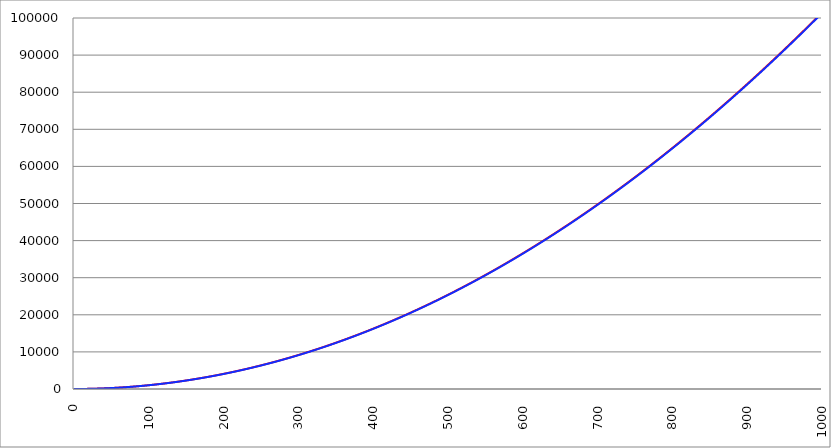
| Category | Series 1 | Series 0 | Series 2 |
|---|---|---|---|
| 0.0 | 0.167 |  | 0 |
| 1.0 | 0.2 |  | 0.101 |
| 2.0 | 0.714 |  | 0.405 |
| 3.0 | 1.4 |  | 0.912 |
| 4.0 | 2.273 |  | 1.621 |
| 5.0 | 3.341 |  | 2.533 |
| 6.0 | 4.609 |  | 3.648 |
| 7.0 | 6.079 |  | 4.965 |
| 8.0 | 7.751 |  | 6.485 |
| 9.0 | 9.625 |  | 8.207 |
| 10.0 | 11.703 |  | 10.132 |
| 11.0 | 13.982 |  | 12.26 |
| 12.0 | 16.465 |  | 14.59 |
| 13.0 | 19.15 |  | 17.123 |
| 14.0 | 22.037 |  | 19.859 |
| 15.0 | 25.128 |  | 22.797 |
| 16.0 | 28.421 |  | 25.938 |
| 17.0 | 31.916 |  | 29.282 |
| 18.0 | 35.614 |  | 32.828 |
| 19.0 | 39.515 |  | 36.577 |
| 20.0 | 43.619 |  | 40.528 |
| 21.0 | 47.925 |  | 44.683 |
| 22.0 | 52.434 |  | 49.039 |
| 23.0 | 57.145 |  | 53.599 |
| 24.0 | 62.059 |  | 58.361 |
| 25.0 | 67.176 |  | 63.326 |
| 26.0 | 72.495 |  | 68.493 |
| 27.0 | 78.017 |  | 73.863 |
| 28.0 | 83.742 |  | 79.436 |
| 29.0 | 89.669 |  | 85.211 |
| 30.0 | 95.799 |  | 91.189 |
| 31.0 | 102.132 |  | 97.37 |
| 32.0 | 108.667 |  | 103.753 |
| 33.0 | 115.405 |  | 110.339 |
| 34.0 | 122.345 |  | 117.127 |
| 35.0 | 129.488 |  | 124.118 |
| 36.0 | 136.834 |  | 131.312 |
| 37.0 | 144.383 |  | 138.709 |
| 38.0 | 152.134 |  | 146.308 |
| 39.0 | 160.087 |  | 154.11 |
| 40.0 | 168.244 |  | 162.114 |
| 41.0 | 176.603 |  | 170.321 |
| 42.0 | 185.164 |  | 178.731 |
| 43.0 | 193.929 |  | 187.343 |
| 44.0 | 202.896 |  | 196.158 |
| 45.0 | 212.065 |  | 205.175 |
| 46.0 | 221.437 |  | 214.396 |
| 47.0 | 231.012 |  | 223.818 |
| 48.0 | 240.79 |  | 233.444 |
| 49.0 | 250.77 |  | 243.272 |
| 50.0 | 260.953 |  | 253.303 |
| 51.0 | 271.338 |  | 263.536 |
| 52.0 | 281.926 |  | 273.972 |
| 53.0 | 292.717 |  | 284.611 |
| 54.0 | 303.71 |  | 295.453 |
| 55.0 | 314.906 |  | 306.497 |
| 56.0 | 326.305 |  | 317.743 |
| 57.0 | 337.906 |  | 329.193 |
| 58.0 | 349.71 |  | 340.844 |
| 59.0 | 361.717 |  | 352.699 |
| 60.0 | 373.926 |  | 364.756 |
| 61.0 | 386.338 |  | 377.016 |
| 62.0 | 398.952 |  | 389.479 |
| 63.0 | 411.769 |  | 402.144 |
| 64.0 | 424.789 |  | 415.012 |
| 65.0 | 438.011 |  | 428.082 |
| 66.0 | 451.437 |  | 441.355 |
| 67.0 | 465.064 |  | 454.831 |
| 68.0 | 478.895 |  | 468.509 |
| 69.0 | 492.928 |  | 482.39 |
| 70.0 | 507.163 |  | 496.474 |
| 71.0 | 521.601 |  | 510.76 |
| 72.0 | 536.242 |  | 525.249 |
| 73.0 | 551.086 |  | 539.941 |
| 74.0 | 566.132 |  | 554.835 |
| 75.0 | 581.381 |  | 569.932 |
| 76.0 | 596.832 |  | 585.231 |
| 77.0 | 612.487 |  | 600.733 |
| 78.0 | 628.343 |  | 616.438 |
| 79.0 | 644.403 |  | 632.346 |
| 80.0 | 660.665 |  | 648.456 |
| 81.0 | 677.129 |  | 664.768 |
| 82.0 | 693.797 |  | 681.284 |
| 83.0 | 710.667 |  | 698.002 |
| 84.0 | 727.739 |  | 714.922 |
| 85.0 | 745.015 |  | 732.046 |
| 86.0 | 762.493 |  | 749.371 |
| 87.0 | 780.173 |  | 766.9 |
| 88.0 | 798.056 |  | 784.631 |
| 89.0 | 816.142 |  | 802.565 |
| 90.0 | 834.431 |  | 820.702 |
| 91.0 | 852.922 |  | 839.041 |
| 92.0 | 871.615 |  | 857.582 |
| 93.0 | 890.512 |  | 876.327 |
| 94.0 | 909.611 |  | 895.274 |
| 95.0 | 928.913 |  | 914.424 |
| 96.0 | 948.417 |  | 933.776 |
| 97.0 | 968.124 |  | 953.331 |
| 98.0 | 988.034 |  | 973.089 |
| 99.0 | 1008.146 |  | 993.049 |
| 100.0 | 1028.461 |  | 1013.212 |
| 101.0 | 1048.978 |  | 1033.577 |
| 102.0 | 1069.698 |  | 1054.146 |
| 103.0 | 1090.621 |  | 1074.916 |
| 104.0 | 1111.747 |  | 1095.89 |
| 105.0 | 1133.075 |  | 1117.066 |
| 106.0 | 1154.606 |  | 1138.445 |
| 107.0 | 1176.339 |  | 1160.026 |
| 108.0 | 1198.275 |  | 1181.81 |
| 109.0 | 1220.414 |  | 1203.797 |
| 110.0 | 1242.755 |  | 1225.986 |
| 111.0 | 1265.299 |  | 1248.378 |
| 112.0 | 1288.046 |  | 1270.973 |
| 113.0 | 1310.995 |  | 1293.77 |
| 114.0 | 1334.147 |  | 1316.77 |
| 115.0 | 1357.501 |  | 1339.973 |
| 116.0 | 1381.058 |  | 1363.378 |
| 117.0 | 1404.818 |  | 1386.986 |
| 118.0 | 1428.781 |  | 1410.796 |
| 119.0 | 1452.946 |  | 1434.809 |
| 120.0 | 1477.314 |  | 1459.025 |
| 121.0 | 1501.884 |  | 1483.443 |
| 122.0 | 1526.657 |  | 1508.064 |
| 123.0 | 1551.633 |  | 1532.888 |
| 124.0 | 1576.811 |  | 1557.915 |
| 125.0 | 1602.192 |  | 1583.143 |
| 126.0 | 1627.775 |  | 1608.575 |
| 127.0 | 1653.562 |  | 1634.209 |
| 128.0 | 1679.551 |  | 1660.046 |
| 129.0 | 1705.742 |  | 1686.086 |
| 130.0 | 1732.136 |  | 1712.328 |
| 131.0 | 1758.733 |  | 1738.773 |
| 132.0 | 1785.533 |  | 1765.42 |
| 133.0 | 1812.535 |  | 1792.27 |
| 134.0 | 1839.739 |  | 1819.323 |
| 135.0 | 1867.147 |  | 1846.579 |
| 136.0 | 1894.757 |  | 1874.037 |
| 137.0 | 1922.569 |  | 1901.697 |
| 138.0 | 1950.585 |  | 1929.561 |
| 139.0 | 1978.803 |  | 1957.627 |
| 140.0 | 2007.223 |  | 1985.895 |
| 141.0 | 2035.847 |  | 2014.366 |
| 142.0 | 2064.672 |  | 2043.04 |
| 143.0 | 2093.701 |  | 2071.917 |
| 144.0 | 2122.932 |  | 2100.996 |
| 145.0 | 2152.366 |  | 2130.278 |
| 146.0 | 2182.002 |  | 2159.762 |
| 147.0 | 2211.841 |  | 2189.449 |
| 148.0 | 2241.883 |  | 2219.339 |
| 149.0 | 2272.128 |  | 2249.432 |
| 150.0 | 2302.575 |  | 2279.727 |
| 151.0 | 2333.224 |  | 2310.224 |
| 152.0 | 2364.077 |  | 2340.925 |
| 153.0 | 2395.131 |  | 2371.828 |
| 154.0 | 2426.389 |  | 2402.933 |
| 155.0 | 2457.849 |  | 2434.241 |
| 156.0 | 2489.512 |  | 2465.752 |
| 157.0 | 2521.378 |  | 2497.466 |
| 158.0 | 2553.446 |  | 2529.382 |
| 159.0 | 2585.717 |  | 2561.501 |
| 160.0 | 2618.19 |  | 2593.822 |
| 161.0 | 2650.866 |  | 2626.346 |
| 162.0 | 2683.745 |  | 2659.073 |
| 163.0 | 2716.826 |  | 2692.003 |
| 164.0 | 2750.11 |  | 2725.135 |
| 165.0 | 2783.597 |  | 2758.469 |
| 166.0 | 2817.286 |  | 2792.007 |
| 167.0 | 2851.178 |  | 2825.746 |
| 168.0 | 2885.273 |  | 2859.689 |
| 169.0 | 2919.57 |  | 2893.834 |
| 170.0 | 2954.07 |  | 2928.182 |
| 171.0 | 2988.772 |  | 2962.733 |
| 172.0 | 3023.677 |  | 2997.486 |
| 173.0 | 3058.785 |  | 3032.442 |
| 174.0 | 3094.096 |  | 3067.6 |
| 175.0 | 3129.609 |  | 3102.961 |
| 176.0 | 3165.324 |  | 3138.525 |
| 177.0 | 3201.243 |  | 3174.291 |
| 178.0 | 3237.364 |  | 3210.26 |
| 179.0 | 3273.687 |  | 3246.432 |
| 180.0 | 3310.214 |  | 3282.806 |
| 181.0 | 3346.943 |  | 3319.383 |
| 182.0 | 3383.874 |  | 3356.163 |
| 183.0 | 3421.008 |  | 3393.145 |
| 184.0 | 3458.345 |  | 3430.33 |
| 185.0 | 3495.885 |  | 3467.718 |
| 186.0 | 3533.627 |  | 3505.308 |
| 187.0 | 3571.572 |  | 3543.1 |
| 188.0 | 3609.719 |  | 3581.096 |
| 189.0 | 3648.069 |  | 3619.294 |
| 190.0 | 3686.622 |  | 3657.695 |
| 191.0 | 3725.377 |  | 3696.298 |
| 192.0 | 3764.335 |  | 3735.104 |
| 193.0 | 3803.496 |  | 3774.113 |
| 194.0 | 3842.859 |  | 3813.324 |
| 195.0 | 3882.425 |  | 3852.738 |
| 196.0 | 3922.194 |  | 3892.355 |
| 197.0 | 3962.165 |  | 3932.174 |
| 198.0 | 4002.339 |  | 3972.196 |
| 199.0 | 4042.715 |  | 4012.42 |
| 200.0 | 4083.294 |  | 4052.847 |
| 201.0 | 4124.076 |  | 4093.477 |
| 202.0 | 4165.061 |  | 4134.31 |
| 203.0 | 4206.248 |  | 4175.345 |
| 204.0 | 4247.637 |  | 4216.582 |
| 205.0 | 4289.23 |  | 4258.023 |
| 206.0 | 4331.025 |  | 4299.666 |
| 207.0 | 4373.022 |  | 4341.511 |
| 208.0 | 4415.223 |  | 4383.56 |
| 209.0 | 4457.625 |  | 4425.811 |
| 210.0 | 4500.231 |  | 4468.264 |
| 211.0 | 4543.039 |  | 4510.92 |
| 212.0 | 4586.05 |  | 4553.779 |
| 213.0 | 4629.264 |  | 4596.841 |
| 214.0 | 4672.68 |  | 4640.105 |
| 215.0 | 4716.298 |  | 4683.572 |
| 216.0 | 4760.12 |  | 4727.241 |
| 217.0 | 4804.144 |  | 4771.113 |
| 218.0 | 4848.371 |  | 4815.188 |
| 219.0 | 4892.8 |  | 4859.465 |
| 220.0 | 4937.432 |  | 4903.945 |
| 221.0 | 4982.267 |  | 4948.628 |
| 222.0 | 5027.304 |  | 4993.513 |
| 223.0 | 5072.544 |  | 5038.601 |
| 224.0 | 5117.986 |  | 5083.892 |
| 225.0 | 5163.631 |  | 5129.385 |
| 226.0 | 5209.479 |  | 5175.081 |
| 227.0 | 5255.53 |  | 5220.979 |
| 228.0 | 5301.783 |  | 5267.08 |
| 229.0 | 5348.239 |  | 5313.384 |
| 230.0 | 5394.897 |  | 5359.891 |
| 231.0 | 5441.758 |  | 5406.6 |
| 232.0 | 5488.822 |  | 5453.511 |
| 233.0 | 5536.088 |  | 5500.626 |
| 234.0 | 5583.557 |  | 5547.943 |
| 235.0 | 5631.229 |  | 5595.462 |
| 236.0 | 5679.103 |  | 5643.185 |
| 237.0 | 5727.18 |  | 5691.11 |
| 238.0 | 5775.459 |  | 5739.237 |
| 239.0 | 5823.942 |  | 5787.567 |
| 240.0 | 5872.626 |  | 5836.1 |
| 241.0 | 5921.514 |  | 5884.836 |
| 242.0 | 5970.604 |  | 5933.774 |
| 243.0 | 6019.897 |  | 5982.915 |
| 244.0 | 6069.392 |  | 6032.258 |
| 245.0 | 6119.09 |  | 6081.804 |
| 246.0 | 6168.991 |  | 6131.553 |
| 247.0 | 6219.094 |  | 6181.504 |
| 248.0 | 6269.4 |  | 6231.658 |
| 249.0 | 6319.909 |  | 6282.015 |
| 250.0 | 6370.62 |  | 6332.574 |
| 251.0 | 6421.534 |  | 6383.336 |
| 252.0 | 6472.651 |  | 6434.3 |
| 253.0 | 6523.97 |  | 6485.468 |
| 254.0 | 6575.492 |  | 6536.837 |
| 255.0 | 6627.216 |  | 6588.41 |
| 256.0 | 6679.143 |  | 6640.185 |
| 257.0 | 6731.273 |  | 6692.163 |
| 258.0 | 6783.605 |  | 6744.343 |
| 259.0 | 6836.14 |  | 6796.726 |
| 260.0 | 6888.878 |  | 6849.312 |
| 261.0 | 6941.818 |  | 6902.1 |
| 262.0 | 6994.961 |  | 6955.091 |
| 263.0 | 7048.307 |  | 7008.285 |
| 264.0 | 7101.855 |  | 7061.681 |
| 265.0 | 7155.606 |  | 7115.28 |
| 266.0 | 7209.559 |  | 7169.082 |
| 267.0 | 7263.716 |  | 7223.086 |
| 268.0 | 7318.074 |  | 7277.293 |
| 269.0 | 7372.636 |  | 7331.702 |
| 270.0 | 7427.4 |  | 7386.314 |
| 271.0 | 7482.367 |  | 7441.129 |
| 272.0 | 7537.536 |  | 7496.146 |
| 273.0 | 7592.908 |  | 7551.366 |
| 274.0 | 7648.483 |  | 7606.789 |
| 275.0 | 7704.26 |  | 7662.415 |
| 276.0 | 7760.24 |  | 7718.242 |
| 277.0 | 7816.423 |  | 7774.273 |
| 278.0 | 7872.808 |  | 7830.506 |
| 279.0 | 7929.396 |  | 7886.942 |
| 280.0 | 7986.186 |  | 7943.581 |
| 281.0 | 8043.18 |  | 8000.422 |
| 282.0 | 8100.375 |  | 8057.466 |
| 283.0 | 8157.774 |  | 8114.712 |
| 284.0 | 8215.375 |  | 8172.161 |
| 285.0 | 8273.179 |  | 8229.813 |
| 286.0 | 8331.185 |  | 8287.668 |
| 287.0 | 8389.394 |  | 8345.725 |
| 288.0 | 8447.806 |  | 8403.984 |
| 289.0 | 8506.42 |  | 8462.447 |
| 290.0 | 8565.237 |  | 8521.112 |
| 291.0 | 8624.257 |  | 8579.979 |
| 292.0 | 8683.479 |  | 8639.049 |
| 293.0 | 8742.904 |  | 8698.322 |
| 294.0 | 8802.531 |  | 8757.798 |
| 295.0 | 8862.361 |  | 8817.476 |
| 296.0 | 8922.394 |  | 8877.357 |
| 297.0 | 8982.63 |  | 8937.44 |
| 298.0 | 9043.068 |  | 8997.726 |
| 299.0 | 9103.708 |  | 9058.215 |
| 300.0 | 9164.552 |  | 9118.907 |
| 301.0 | 9225.598 |  | 9179.801 |
| 302.0 | 9286.846 |  | 9240.897 |
| 303.0 | 9348.298 |  | 9302.197 |
| 304.0 | 9409.952 |  | 9363.699 |
| 305.0 | 9471.808 |  | 9425.403 |
| 306.0 | 9533.867 |  | 9487.31 |
| 307.0 | 9596.129 |  | 9549.42 |
| 308.0 | 9658.594 |  | 9611.733 |
| 309.0 | 9721.261 |  | 9674.248 |
| 310.0 | 9784.131 |  | 9736.966 |
| 311.0 | 9847.203 |  | 9799.886 |
| 312.0 | 9910.478 |  | 9863.009 |
| 313.0 | 9973.956 |  | 9926.335 |
| 314.0 | 10037.636 |  | 9989.863 |
| 315.0 | 10101.519 |  | 10053.594 |
| 316.0 | 10165.605 |  | 10117.528 |
| 317.0 | 10229.893 |  | 10181.664 |
| 318.0 | 10294.384 |  | 10246.003 |
| 319.0 | 10359.078 |  | 10310.545 |
| 320.0 | 10423.974 |  | 10375.289 |
| 321.0 | 10489.073 |  | 10440.236 |
| 322.0 | 10554.374 |  | 10505.386 |
| 323.0 | 10619.879 |  | 10570.738 |
| 324.0 | 10685.585 |  | 10636.293 |
| 325.0 | 10751.495 |  | 10702.05 |
| 326.0 | 10817.607 |  | 10768.01 |
| 327.0 | 10883.922 |  | 10834.173 |
| 328.0 | 10950.439 |  | 10900.538 |
| 329.0 | 11017.159 |  | 10967.106 |
| 330.0 | 11084.082 |  | 11033.877 |
| 331.0 | 11151.207 |  | 11100.85 |
| 332.0 | 11218.535 |  | 11168.026 |
| 333.0 | 11286.065 |  | 11235.405 |
| 334.0 | 11353.799 |  | 11302.986 |
| 335.0 | 11421.734 |  | 11370.77 |
| 336.0 | 11489.873 |  | 11438.756 |
| 337.0 | 11558.214 |  | 11506.946 |
| 338.0 | 11626.758 |  | 11575.337 |
| 339.0 | 11695.504 |  | 11643.932 |
| 340.0 | 11764.453 |  | 11712.729 |
| 341.0 | 11833.605 |  | 11781.729 |
| 342.0 | 11902.959 |  | 11850.931 |
| 343.0 | 11972.516 |  | 11920.336 |
| 344.0 | 12042.276 |  | 11989.944 |
| 345.0 | 12112.238 |  | 12059.754 |
| 346.0 | 12182.403 |  | 12129.767 |
| 347.0 | 12252.771 |  | 12199.982 |
| 348.0 | 12323.341 |  | 12270.401 |
| 349.0 | 12394.114 |  | 12341.021 |
| 350.0 | 12465.089 |  | 12411.845 |
| 351.0 | 12536.267 |  | 12482.871 |
| 352.0 | 12607.648 |  | 12554.1 |
| 353.0 | 12679.232 |  | 12625.531 |
| 354.0 | 12751.018 |  | 12697.165 |
| 355.0 | 12823.006 |  | 12769.002 |
| 356.0 | 12895.198 |  | 12841.042 |
| 357.0 | 12967.592 |  | 12913.284 |
| 358.0 | 13040.188 |  | 12985.728 |
| 359.0 | 13112.988 |  | 13058.375 |
| 360.0 | 13185.989 |  | 13131.225 |
| 361.0 | 13259.194 |  | 13204.278 |
| 362.0 | 13332.601 |  | 13277.533 |
| 363.0 | 13406.211 |  | 13350.991 |
| 364.0 | 13480.024 |  | 13424.652 |
| 365.0 | 13554.039 |  | 13498.515 |
| 366.0 | 13628.256 |  | 13572.58 |
| 367.0 | 13702.677 |  | 13646.849 |
| 368.0 | 13777.3 |  | 13721.32 |
| 369.0 | 13852.126 |  | 13795.994 |
| 370.0 | 13927.154 |  | 13870.87 |
| 371.0 | 14002.385 |  | 13945.949 |
| 372.0 | 14077.819 |  | 14021.231 |
| 373.0 | 14153.455 |  | 14096.715 |
| 374.0 | 14229.294 |  | 14172.402 |
| 375.0 | 14305.335 |  | 14248.291 |
| 376.0 | 14381.579 |  | 14324.384 |
| 377.0 | 14458.026 |  | 14400.679 |
| 378.0 | 14534.676 |  | 14477.176 |
| 379.0 | 14611.528 |  | 14553.876 |
| 380.0 | 14688.583 |  | 14630.779 |
| 381.0 | 14765.84 |  | 14707.884 |
| 382.0 | 14843.3 |  | 14785.192 |
| 383.0 | 14920.963 |  | 14862.703 |
| 384.0 | 14998.828 |  | 14940.416 |
| 385.0 | 15076.896 |  | 15018.332 |
| 386.0 | 15155.167 |  | 15096.451 |
| 387.0 | 15233.64 |  | 15174.772 |
| 388.0 | 15312.316 |  | 15253.296 |
| 389.0 | 15391.194 |  | 15332.023 |
| 390.0 | 15470.276 |  | 15410.952 |
| 391.0 | 15549.559 |  | 15490.084 |
| 392.0 | 15629.046 |  | 15569.418 |
| 393.0 | 15708.735 |  | 15648.955 |
| 394.0 | 15788.627 |  | 15728.695 |
| 395.0 | 15868.721 |  | 15808.638 |
| 396.0 | 15949.018 |  | 15888.783 |
| 397.0 | 16029.518 |  | 15969.13 |
| 398.0 | 16110.22 |  | 16049.681 |
| 399.0 | 16191.125 |  | 16130.434 |
| 400.0 | 16272.233 |  | 16211.389 |
| 401.0 | 16353.543 |  | 16292.548 |
| 402.0 | 16435.056 |  | 16373.909 |
| 403.0 | 16516.771 |  | 16455.472 |
| 404.0 | 16598.69 |  | 16537.238 |
| 405.0 | 16680.81 |  | 16619.207 |
| 406.0 | 16763.134 |  | 16701.379 |
| 407.0 | 16845.66 |  | 16783.753 |
| 408.0 | 16928.389 |  | 16866.33 |
| 409.0 | 17011.32 |  | 16949.109 |
| 410.0 | 17094.454 |  | 17032.091 |
| 411.0 | 17177.791 |  | 17115.276 |
| 412.0 | 17261.33 |  | 17198.663 |
| 413.0 | 17345.072 |  | 17282.253 |
| 414.0 | 17429.017 |  | 17366.046 |
| 415.0 | 17513.164 |  | 17450.041 |
| 416.0 | 17597.514 |  | 17534.239 |
| 417.0 | 17682.066 |  | 17618.639 |
| 418.0 | 17766.822 |  | 17703.242 |
| 419.0 | 17851.779 |  | 17788.048 |
| 420.0 | 17936.94 |  | 17873.057 |
| 421.0 | 18022.303 |  | 17958.268 |
| 422.0 | 18107.869 |  | 18043.682 |
| 423.0 | 18193.637 |  | 18129.298 |
| 424.0 | 18279.608 |  | 18215.117 |
| 425.0 | 18365.782 |  | 18301.139 |
| 426.0 | 18452.158 |  | 18387.363 |
| 427.0 | 18538.737 |  | 18473.79 |
| 428.0 | 18625.519 |  | 18560.42 |
| 429.0 | 18712.503 |  | 18647.252 |
| 430.0 | 18799.69 |  | 18734.287 |
| 431.0 | 18887.079 |  | 18821.524 |
| 432.0 | 18974.671 |  | 18908.965 |
| 433.0 | 19062.466 |  | 18996.607 |
| 434.0 | 19150.464 |  | 19084.453 |
| 435.0 | 19238.664 |  | 19172.501 |
| 436.0 | 19327.066 |  | 19260.752 |
| 437.0 | 19415.672 |  | 19349.205 |
| 438.0 | 19504.48 |  | 19437.861 |
| 439.0 | 19593.49 |  | 19526.72 |
| 440.0 | 19682.704 |  | 19615.781 |
| 441.0 | 19772.12 |  | 19705.045 |
| 442.0 | 19861.738 |  | 19794.512 |
| 443.0 | 19951.56 |  | 19884.181 |
| 444.0 | 20041.583 |  | 19974.053 |
| 445.0 | 20131.81 |  | 20064.127 |
| 446.0 | 20222.239 |  | 20154.405 |
| 447.0 | 20312.871 |  | 20244.884 |
| 448.0 | 20403.705 |  | 20335.567 |
| 449.0 | 20494.742 |  | 20426.452 |
| 450.0 | 20585.982 |  | 20517.54 |
| 451.0 | 20677.425 |  | 20608.83 |
| 452.0 | 20769.07 |  | 20700.323 |
| 453.0 | 20860.917 |  | 20792.019 |
| 454.0 | 20952.967 |  | 20883.917 |
| 455.0 | 21045.22 |  | 20976.018 |
| 456.0 | 21137.676 |  | 21068.322 |
| 457.0 | 21230.334 |  | 21160.828 |
| 458.0 | 21323.195 |  | 21253.537 |
| 459.0 | 21416.259 |  | 21346.448 |
| 460.0 | 21509.525 |  | 21439.562 |
| 461.0 | 21602.994 |  | 21532.879 |
| 462.0 | 21696.665 |  | 21626.399 |
| 463.0 | 21790.539 |  | 21720.121 |
| 464.0 | 21884.616 |  | 21814.046 |
| 465.0 | 21978.895 |  | 21908.173 |
| 466.0 | 22073.377 |  | 22002.503 |
| 467.0 | 22168.062 |  | 22097.036 |
| 468.0 | 22262.949 |  | 22191.771 |
| 469.0 | 22358.039 |  | 22286.709 |
| 470.0 | 22453.332 |  | 22381.849 |
| 471.0 | 22548.827 |  | 22477.193 |
| 472.0 | 22644.525 |  | 22572.739 |
| 473.0 | 22740.425 |  | 22668.487 |
| 474.0 | 22836.528 |  | 22764.438 |
| 475.0 | 22932.834 |  | 22860.592 |
| 476.0 | 23029.342 |  | 22956.949 |
| 477.0 | 23126.054 |  | 23053.508 |
| 478.0 | 23222.967 |  | 23150.269 |
| 479.0 | 23320.084 |  | 23247.234 |
| 480.0 | 23417.403 |  | 23344.401 |
| 481.0 | 23514.924 |  | 23441.77 |
| 482.0 | 23612.649 |  | 23539.343 |
| 483.0 | 23710.575 |  | 23637.118 |
| 484.0 | 23808.705 |  | 23735.095 |
| 485.0 | 23907.037 |  | 23833.275 |
| 486.0 | 24005.572 |  | 23931.658 |
| 487.0 | 24104.31 |  | 24030.244 |
| 488.0 | 24203.25 |  | 24129.032 |
| 489.0 | 24302.393 |  | 24228.023 |
| 490.0 | 24401.738 |  | 24327.216 |
| 491.0 | 24501.286 |  | 24426.612 |
| 492.0 | 24601.037 |  | 24526.211 |
| 493.0 | 24700.99 |  | 24626.012 |
| 494.0 | 24801.146 |  | 24726.016 |
| 495.0 | 24901.505 |  | 24826.223 |
| 496.0 | 25002.066 |  | 24926.632 |
| 497.0 | 25102.83 |  | 25027.244 |
| 498.0 | 25203.796 |  | 25128.059 |
| 499.0 | 25304.966 |  | 25229.076 |
| 500.0 | 25406.337 |  | 25330.296 |
| 501.0 | 25507.912 |  | 25431.718 |
| 502.0 | 25609.689 |  | 25533.344 |
| 503.0 | 25711.669 |  | 25635.171 |
| 504.0 | 25813.851 |  | 25737.202 |
| 505.0 | 25916.236 |  | 25839.435 |
| 506.0 | 26018.824 |  | 25941.871 |
| 507.0 | 26121.614 |  | 26044.509 |
| 508.0 | 26224.607 |  | 26147.35 |
| 509.0 | 26327.803 |  | 26250.394 |
| 510.0 | 26431.201 |  | 26353.64 |
| 511.0 | 26534.802 |  | 26457.089 |
| 512.0 | 26638.606 |  | 26560.74 |
| 513.0 | 26742.612 |  | 26664.595 |
| 514.0 | 26846.821 |  | 26768.651 |
| 515.0 | 26951.232 |  | 26872.911 |
| 516.0 | 27055.846 |  | 26977.373 |
| 517.0 | 27160.663 |  | 27082.038 |
| 518.0 | 27265.682 |  | 27186.905 |
| 519.0 | 27370.905 |  | 27291.975 |
| 520.0 | 27476.329 |  | 27397.248 |
| 521.0 | 27581.957 |  | 27502.723 |
| 522.0 | 27687.787 |  | 27608.401 |
| 523.0 | 27793.819 |  | 27714.282 |
| 524.0 | 27900.054 |  | 27820.365 |
| 525.0 | 28006.492 |  | 27926.651 |
| 526.0 | 28113.133 |  | 28033.14 |
| 527.0 | 28219.976 |  | 28139.831 |
| 528.0 | 28327.022 |  | 28246.725 |
| 529.0 | 28434.27 |  | 28353.821 |
| 530.0 | 28541.721 |  | 28461.12 |
| 531.0 | 28649.375 |  | 28568.622 |
| 532.0 | 28757.232 |  | 28676.327 |
| 533.0 | 28865.291 |  | 28784.234 |
| 534.0 | 28973.552 |  | 28892.343 |
| 535.0 | 29082.017 |  | 29000.656 |
| 536.0 | 29190.684 |  | 29109.171 |
| 537.0 | 29299.553 |  | 29217.888 |
| 538.0 | 29408.626 |  | 29326.809 |
| 539.0 | 29517.9 |  | 29435.932 |
| 540.0 | 29627.378 |  | 29545.257 |
| 541.0 | 29737.058 |  | 29654.785 |
| 542.0 | 29846.941 |  | 29764.516 |
| 543.0 | 29957.026 |  | 29874.45 |
| 544.0 | 30067.315 |  | 29984.586 |
| 545.0 | 30177.805 |  | 30094.925 |
| 546.0 | 30288.499 |  | 30205.466 |
| 547.0 | 30399.395 |  | 30316.21 |
| 548.0 | 30510.493 |  | 30427.157 |
| 549.0 | 30621.795 |  | 30538.306 |
| 550.0 | 30733.299 |  | 30649.658 |
| 551.0 | 30845.005 |  | 30761.213 |
| 552.0 | 30956.915 |  | 30872.97 |
| 553.0 | 31069.026 |  | 30984.93 |
| 554.0 | 31181.341 |  | 31097.092 |
| 555.0 | 31293.858 |  | 31209.458 |
| 556.0 | 31406.578 |  | 31322.025 |
| 557.0 | 31519.5 |  | 31434.796 |
| 558.0 | 31632.626 |  | 31547.769 |
| 559.0 | 31745.953 |  | 31660.945 |
| 560.0 | 31859.484 |  | 31774.323 |
| 561.0 | 31973.217 |  | 31887.904 |
| 562.0 | 32087.152 |  | 32001.688 |
| 563.0 | 32201.291 |  | 32115.674 |
| 564.0 | 32315.632 |  | 32229.863 |
| 565.0 | 32430.175 |  | 32344.255 |
| 566.0 | 32544.921 |  | 32458.849 |
| 567.0 | 32659.87 |  | 32573.646 |
| 568.0 | 32775.022 |  | 32688.646 |
| 569.0 | 32890.376 |  | 32803.848 |
| 570.0 | 33005.933 |  | 32919.253 |
| 571.0 | 33121.692 |  | 33034.86 |
| 572.0 | 33237.654 |  | 33150.67 |
| 573.0 | 33353.819 |  | 33266.683 |
| 574.0 | 33470.187 |  | 33382.898 |
| 575.0 | 33586.757 |  | 33499.316 |
| 576.0 | 33703.529 |  | 33615.937 |
| 577.0 | 33820.504 |  | 33732.76 |
| 578.0 | 33937.682 |  | 33849.786 |
| 579.0 | 34055.063 |  | 33967.015 |
| 580.0 | 34172.646 |  | 34084.446 |
| 581.0 | 34290.432 |  | 34202.08 |
| 582.0 | 34408.421 |  | 34319.917 |
| 583.0 | 34526.612 |  | 34437.956 |
| 584.0 | 34645.006 |  | 34556.198 |
| 585.0 | 34763.602 |  | 34674.642 |
| 586.0 | 34882.401 |  | 34793.289 |
| 587.0 | 35001.403 |  | 34912.139 |
| 588.0 | 35120.607 |  | 35031.191 |
| 589.0 | 35240.014 |  | 35150.446 |
| 590.0 | 35359.624 |  | 35269.904 |
| 591.0 | 35479.436 |  | 35389.564 |
| 592.0 | 35599.451 |  | 35509.427 |
| 593.0 | 35719.669 |  | 35629.493 |
| 594.0 | 35840.089 |  | 35749.761 |
| 595.0 | 35960.712 |  | 35870.232 |
| 596.0 | 36081.537 |  | 35990.906 |
| 597.0 | 36202.566 |  | 36111.782 |
| 598.0 | 36323.796 |  | 36232.861 |
| 599.0 | 36445.23 |  | 36354.142 |
| 600.0 | 36566.866 |  | 36475.626 |
| 601.0 | 36688.705 |  | 36597.313 |
| 602.0 | 36810.746 |  | 36719.202 |
| 603.0 | 36932.99 |  | 36841.294 |
| 604.0 | 37055.437 |  | 36963.589 |
| 605.0 | 37178.086 |  | 37086.086 |
| 606.0 | 37300.938 |  | 37208.786 |
| 607.0 | 37423.992 |  | 37331.689 |
| 608.0 | 37547.25 |  | 37454.794 |
| 609.0 | 37670.709 |  | 37578.102 |
| 610.0 | 37794.372 |  | 37701.612 |
| 611.0 | 37918.237 |  | 37825.326 |
| 612.0 | 38042.305 |  | 37949.241 |
| 613.0 | 38166.575 |  | 38073.36 |
| 614.0 | 38291.048 |  | 38197.681 |
| 615.0 | 38415.724 |  | 38322.205 |
| 616.0 | 38540.602 |  | 38446.931 |
| 617.0 | 38665.683 |  | 38571.86 |
| 618.0 | 38790.967 |  | 38696.992 |
| 619.0 | 38916.453 |  | 38822.326 |
| 620.0 | 39042.142 |  | 38947.863 |
| 621.0 | 39168.034 |  | 39073.603 |
| 622.0 | 39294.128 |  | 39199.545 |
| 623.0 | 39420.425 |  | 39325.69 |
| 624.0 | 39546.924 |  | 39452.037 |
| 625.0 | 39673.627 |  | 39578.587 |
| 626.0 | 39800.531 |  | 39705.34 |
| 627.0 | 39927.639 |  | 39832.296 |
| 628.0 | 40054.949 |  | 39959.454 |
| 629.0 | 40182.462 |  | 40086.814 |
| 630.0 | 40310.177 |  | 40214.378 |
| 631.0 | 40438.095 |  | 40342.144 |
| 632.0 | 40566.216 |  | 40470.112 |
| 633.0 | 40694.539 |  | 40598.284 |
| 634.0 | 40823.065 |  | 40726.658 |
| 635.0 | 40951.793 |  | 40855.234 |
| 636.0 | 41080.725 |  | 40984.013 |
| 637.0 | 41209.858 |  | 41112.995 |
| 638.0 | 41339.195 |  | 41242.18 |
| 639.0 | 41468.734 |  | 41371.567 |
| 640.0 | 41598.476 |  | 41501.157 |
| 641.0 | 41728.42 |  | 41630.949 |
| 642.0 | 41858.567 |  | 41760.944 |
| 643.0 | 41988.917 |  | 41891.142 |
| 644.0 | 42119.469 |  | 42021.542 |
| 645.0 | 42250.224 |  | 42152.145 |
| 646.0 | 42381.182 |  | 42282.951 |
| 647.0 | 42512.342 |  | 42413.959 |
| 648.0 | 42643.705 |  | 42545.17 |
| 649.0 | 42775.271 |  | 42676.584 |
| 650.0 | 42907.039 |  | 42808.2 |
| 651.0 | 43039.01 |  | 42940.019 |
| 652.0 | 43171.183 |  | 43072.04 |
| 653.0 | 43303.559 |  | 43204.265 |
| 654.0 | 43436.138 |  | 43336.691 |
| 655.0 | 43568.92 |  | 43469.321 |
| 656.0 | 43701.904 |  | 43602.153 |
| 657.0 | 43835.09 |  | 43735.188 |
| 658.0 | 43968.48 |  | 43868.425 |
| 659.0 | 44102.072 |  | 44001.865 |
| 660.0 | 44235.866 |  | 44135.508 |
| 661.0 | 44369.863 |  | 44269.353 |
| 662.0 | 44504.063 |  | 44403.401 |
| 663.0 | 44638.466 |  | 44537.651 |
| 664.0 | 44773.071 |  | 44672.105 |
| 665.0 | 44907.879 |  | 44806.76 |
| 666.0 | 45042.889 |  | 44941.619 |
| 667.0 | 45178.103 |  | 45076.68 |
| 668.0 | 45313.518 |  | 45211.944 |
| 669.0 | 45449.137 |  | 45347.41 |
| 670.0 | 45584.958 |  | 45483.079 |
| 671.0 | 45720.981 |  | 45618.951 |
| 672.0 | 45857.208 |  | 45755.025 |
| 673.0 | 45993.637 |  | 45891.302 |
| 674.0 | 46130.268 |  | 46027.782 |
| 675.0 | 46267.103 |  | 46164.464 |
| 676.0 | 46404.14 |  | 46301.349 |
| 677.0 | 46541.379 |  | 46438.437 |
| 678.0 | 46678.821 |  | 46575.727 |
| 679.0 | 46816.466 |  | 46713.22 |
| 680.0 | 46954.314 |  | 46850.915 |
| 681.0 | 47092.364 |  | 46988.813 |
| 682.0 | 47230.616 |  | 47126.914 |
| 683.0 | 47369.072 |  | 47265.218 |
| 684.0 | 47507.73 |  | 47403.724 |
| 685.0 | 47646.591 |  | 47542.432 |
| 686.0 | 47785.654 |  | 47681.344 |
| 687.0 | 47924.92 |  | 47820.458 |
| 688.0 | 48064.388 |  | 47959.774 |
| 689.0 | 48204.06 |  | 48099.294 |
| 690.0 | 48343.934 |  | 48239.016 |
| 691.0 | 48484.01 |  | 48378.94 |
| 692.0 | 48624.289 |  | 48519.067 |
| 693.0 | 48764.771 |  | 48659.397 |
| 694.0 | 48905.456 |  | 48799.93 |
| 695.0 | 49046.343 |  | 48940.665 |
| 696.0 | 49187.432 |  | 49081.602 |
| 697.0 | 49328.725 |  | 49222.743 |
| 698.0 | 49470.22 |  | 49364.086 |
| 699.0 | 49611.918 |  | 49505.632 |
| 700.0 | 49753.818 |  | 49647.38 |
| 701.0 | 49895.921 |  | 49789.331 |
| 702.0 | 50038.226 |  | 49931.485 |
| 703.0 | 50180.735 |  | 50073.841 |
| 704.0 | 50323.446 |  | 50216.4 |
| 705.0 | 50466.359 |  | 50359.161 |
| 706.0 | 50609.475 |  | 50502.125 |
| 707.0 | 50752.794 |  | 50645.292 |
| 708.0 | 50896.316 |  | 50788.662 |
| 709.0 | 51040.04 |  | 50932.234 |
| 710.0 | 51183.966 |  | 51076.009 |
| 711.0 | 51328.096 |  | 51219.986 |
| 712.0 | 51472.428 |  | 51364.166 |
| 713.0 | 51616.962 |  | 51508.549 |
| 714.0 | 51761.7 |  | 51653.134 |
| 715.0 | 51906.64 |  | 51797.922 |
| 716.0 | 52051.782 |  | 51942.913 |
| 717.0 | 52197.128 |  | 52088.106 |
| 718.0 | 52342.675 |  | 52233.502 |
| 719.0 | 52488.426 |  | 52379.1 |
| 720.0 | 52634.379 |  | 52524.902 |
| 721.0 | 52780.535 |  | 52670.905 |
| 722.0 | 52926.893 |  | 52817.112 |
| 723.0 | 53073.454 |  | 52963.521 |
| 724.0 | 53220.218 |  | 53110.133 |
| 725.0 | 53367.185 |  | 53256.947 |
| 726.0 | 53514.354 |  | 53403.964 |
| 727.0 | 53661.725 |  | 53551.184 |
| 728.0 | 53809.3 |  | 53698.606 |
| 729.0 | 53957.077 |  | 53846.231 |
| 730.0 | 54105.056 |  | 53994.059 |
| 731.0 | 54253.238 |  | 54142.089 |
| 732.0 | 54401.623 |  | 54290.322 |
| 733.0 | 54550.211 |  | 54438.757 |
| 734.0 | 54699.001 |  | 54587.396 |
| 735.0 | 54847.994 |  | 54736.236 |
| 736.0 | 54997.189 |  | 54885.28 |
| 737.0 | 55146.587 |  | 55034.526 |
| 738.0 | 55296.188 |  | 55183.975 |
| 739.0 | 55445.991 |  | 55333.626 |
| 740.0 | 55595.997 |  | 55483.48 |
| 741.0 | 55746.206 |  | 55633.537 |
| 742.0 | 55896.617 |  | 55783.796 |
| 743.0 | 56047.231 |  | 55934.258 |
| 744.0 | 56198.048 |  | 56084.923 |
| 745.0 | 56349.067 |  | 56235.79 |
| 746.0 | 56500.289 |  | 56386.86 |
| 747.0 | 56651.713 |  | 56538.132 |
| 748.0 | 56803.341 |  | 56689.608 |
| 749.0 | 56955.17 |  | 56841.285 |
| 750.0 | 57107.203 |  | 56993.166 |
| 751.0 | 57259.438 |  | 57145.249 |
| 752.0 | 57411.876 |  | 57297.535 |
| 753.0 | 57564.516 |  | 57450.023 |
| 754.0 | 57717.359 |  | 57602.714 |
| 755.0 | 57870.405 |  | 57755.608 |
| 756.0 | 58023.653 |  | 57908.704 |
| 757.0 | 58177.104 |  | 58062.003 |
| 758.0 | 58330.757 |  | 58215.505 |
| 759.0 | 58484.614 |  | 58369.209 |
| 760.0 | 58638.672 |  | 58523.116 |
| 761.0 | 58792.934 |  | 58677.225 |
| 762.0 | 58947.398 |  | 58831.537 |
| 763.0 | 59102.065 |  | 58986.052 |
| 764.0 | 59256.934 |  | 59140.77 |
| 765.0 | 59412.006 |  | 59295.69 |
| 766.0 | 59567.281 |  | 59450.812 |
| 767.0 | 59722.758 |  | 59606.138 |
| 768.0 | 59878.438 |  | 59761.666 |
| 769.0 | 60034.321 |  | 59917.396 |
| 770.0 | 60190.406 |  | 60073.33 |
| 771.0 | 60346.694 |  | 60229.466 |
| 772.0 | 60503.185 |  | 60385.804 |
| 773.0 | 60659.878 |  | 60542.346 |
| 774.0 | 60816.774 |  | 60699.089 |
| 775.0 | 60973.872 |  | 60856.036 |
| 776.0 | 61131.174 |  | 61013.185 |
| 777.0 | 61288.677 |  | 61170.537 |
| 778.0 | 61446.384 |  | 61328.091 |
| 779.0 | 61604.293 |  | 61485.848 |
| 780.0 | 61762.405 |  | 61643.808 |
| 781.0 | 61920.719 |  | 61801.97 |
| 782.0 | 62079.236 |  | 61960.336 |
| 783.0 | 62237.956 |  | 62118.903 |
| 784.0 | 62396.878 |  | 62277.673 |
| 785.0 | 62556.003 |  | 62436.646 |
| 786.0 | 62715.33 |  | 62595.822 |
| 787.0 | 62874.861 |  | 62755.2 |
| 788.0 | 63034.593 |  | 62914.781 |
| 789.0 | 63194.529 |  | 63074.565 |
| 790.0 | 63354.667 |  | 63234.551 |
| 791.0 | 63515.008 |  | 63394.74 |
| 792.0 | 63675.551 |  | 63555.131 |
| 793.0 | 63836.297 |  | 63715.725 |
| 794.0 | 63997.246 |  | 63876.522 |
| 795.0 | 64158.397 |  | 64037.521 |
| 796.0 | 64319.751 |  | 64198.723 |
| 797.0 | 64481.308 |  | 64360.128 |
| 798.0 | 64643.067 |  | 64521.735 |
| 799.0 | 64805.029 |  | 64683.545 |
| 800.0 | 64967.194 |  | 64845.558 |
| 801.0 | 65129.561 |  | 65007.773 |
| 802.0 | 65292.131 |  | 65170.191 |
| 803.0 | 65454.903 |  | 65332.811 |
| 804.0 | 65617.878 |  | 65495.634 |
| 805.0 | 65781.056 |  | 65658.66 |
| 806.0 | 65944.436 |  | 65821.888 |
| 807.0 | 66108.019 |  | 65985.32 |
| 808.0 | 66271.805 |  | 66148.953 |
| 809.0 | 66435.794 |  | 66312.79 |
| 810.0 | 66599.984 |  | 66476.829 |
| 811.0 | 66764.378 |  | 66641.07 |
| 812.0 | 66928.974 |  | 66805.515 |
| 813.0 | 67093.773 |  | 66970.161 |
| 814.0 | 67258.775 |  | 67135.011 |
| 815.0 | 67423.979 |  | 67300.063 |
| 816.0 | 67589.386 |  | 67465.318 |
| 817.0 | 67754.995 |  | 67630.776 |
| 818.0 | 67920.807 |  | 67796.436 |
| 819.0 | 68086.822 |  | 67962.298 |
| 820.0 | 68253.04 |  | 68128.364 |
| 821.0 | 68419.46 |  | 68294.632 |
| 822.0 | 68586.082 |  | 68461.103 |
| 823.0 | 68752.908 |  | 68627.776 |
| 824.0 | 68919.936 |  | 68794.652 |
| 825.0 | 69087.166 |  | 68961.731 |
| 826.0 | 69254.599 |  | 69129.012 |
| 827.0 | 69422.235 |  | 69296.496 |
| 828.0 | 69590.074 |  | 69464.182 |
| 829.0 | 69758.115 |  | 69632.072 |
| 830.0 | 69926.359 |  | 69800.163 |
| 831.0 | 70094.805 |  | 69968.458 |
| 832.0 | 70263.455 |  | 70136.955 |
| 833.0 | 70432.306 |  | 70305.655 |
| 834.0 | 70601.361 |  | 70474.557 |
| 835.0 | 70770.618 |  | 70643.662 |
| 836.0 | 70940.077 |  | 70812.97 |
| 837.0 | 71109.74 |  | 70982.48 |
| 838.0 | 71279.605 |  | 71152.193 |
| 839.0 | 71449.672 |  | 71322.109 |
| 840.0 | 71619.943 |  | 71492.227 |
| 841.0 | 71790.415 |  | 71662.548 |
| 842.0 | 71961.091 |  | 71833.072 |
| 843.0 | 72131.969 |  | 72003.798 |
| 844.0 | 72303.05 |  | 72174.727 |
| 845.0 | 72474.333 |  | 72345.858 |
| 846.0 | 72645.82 |  | 72517.192 |
| 847.0 | 72817.508 |  | 72688.729 |
| 848.0 | 72989.4 |  | 72860.468 |
| 849.0 | 73161.494 |  | 73032.41 |
| 850.0 | 73333.79 |  | 73204.555 |
| 851.0 | 73506.29 |  | 73376.903 |
| 852.0 | 73678.992 |  | 73549.452 |
| 853.0 | 73851.896 |  | 73722.205 |
| 854.0 | 74025.003 |  | 73895.16 |
| 855.0 | 74198.313 |  | 74068.318 |
| 856.0 | 74371.826 |  | 74241.679 |
| 857.0 | 74545.541 |  | 74415.242 |
| 858.0 | 74719.459 |  | 74589.008 |
| 859.0 | 74893.579 |  | 74762.976 |
| 860.0 | 75067.902 |  | 74937.147 |
| 861.0 | 75242.428 |  | 75111.521 |
| 862.0 | 75417.157 |  | 75286.098 |
| 863.0 | 75592.088 |  | 75460.877 |
| 864.0 | 75767.221 |  | 75635.858 |
| 865.0 | 75942.558 |  | 75811.043 |
| 866.0 | 76118.096 |  | 75986.43 |
| 867.0 | 76293.838 |  | 76162.019 |
| 868.0 | 76469.782 |  | 76337.811 |
| 869.0 | 76645.929 |  | 76513.806 |
| 870.0 | 76822.279 |  | 76690.004 |
| 871.0 | 76998.831 |  | 76866.404 |
| 872.0 | 77175.586 |  | 77043.007 |
| 873.0 | 77352.543 |  | 77219.812 |
| 874.0 | 77529.703 |  | 77396.82 |
| 875.0 | 77707.066 |  | 77574.031 |
| 876.0 | 77884.631 |  | 77751.445 |
| 877.0 | 78062.399 |  | 77929.061 |
| 878.0 | 78240.37 |  | 78106.879 |
| 879.0 | 78418.543 |  | 78284.901 |
| 880.0 | 78596.919 |  | 78463.125 |
| 881.0 | 78775.498 |  | 78641.551 |
| 882.0 | 78954.279 |  | 78820.18 |
| 883.0 | 79133.263 |  | 78999.012 |
| 884.0 | 79312.449 |  | 79178.047 |
| 885.0 | 79491.839 |  | 79357.284 |
| 886.0 | 79671.43 |  | 79536.724 |
| 887.0 | 79851.225 |  | 79716.366 |
| 888.0 | 80031.222 |  | 79896.211 |
| 889.0 | 80211.422 |  | 80076.259 |
| 890.0 | 80391.824 |  | 80256.51 |
| 891.0 | 80572.429 |  | 80436.963 |
| 892.0 | 80753.237 |  | 80617.618 |
| 893.0 | 80934.247 |  | 80798.477 |
| 894.0 | 81115.46 |  | 80979.538 |
| 895.0 | 81296.875 |  | 81160.801 |
| 896.0 | 81478.494 |  | 81342.267 |
| 897.0 | 81660.315 |  | 81523.936 |
| 898.0 | 81842.338 |  | 81705.808 |
| 899.0 | 82024.564 |  | 81887.882 |
| 900.0 | 82206.993 |  | 82070.159 |
| 901.0 | 82389.624 |  | 82252.638 |
| 902.0 | 82572.459 |  | 82435.32 |
| 903.0 | 82755.495 |  | 82618.205 |
| 904.0 | 82938.735 |  | 82801.292 |
| 905.0 | 83122.177 |  | 82984.582 |
| 906.0 | 83305.821 |  | 83168.075 |
| 907.0 | 83489.669 |  | 83351.77 |
| 908.0 | 83673.718 |  | 83535.668 |
| 909.0 | 83857.971 |  | 83719.769 |
| 910.0 | 84042.426 |  | 83904.072 |
| 911.0 | 84227.084 |  | 84088.578 |
| 912.0 | 84411.945 |  | 84273.287 |
| 913.0 | 84597.008 |  | 84458.198 |
| 914.0 | 84782.274 |  | 84643.312 |
| 915.0 | 84967.742 |  | 84828.628 |
| 916.0 | 85153.413 |  | 85014.147 |
| 917.0 | 85339.287 |  | 85199.869 |
| 918.0 | 85525.363 |  | 85385.793 |
| 919.0 | 85711.642 |  | 85571.92 |
| 920.0 | 85898.124 |  | 85758.25 |
| 921.0 | 86084.808 |  | 85944.782 |
| 922.0 | 86271.695 |  | 86131.517 |
| 923.0 | 86458.784 |  | 86318.455 |
| 924.0 | 86646.077 |  | 86505.595 |
| 925.0 | 86833.572 |  | 86692.938 |
| 926.0 | 87021.269 |  | 86880.483 |
| 927.0 | 87209.169 |  | 87068.231 |
| 928.0 | 87397.272 |  | 87256.182 |
| 929.0 | 87585.577 |  | 87444.336 |
| 930.0 | 87774.085 |  | 87632.692 |
| 931.0 | 87962.796 |  | 87821.25 |
| 932.0 | 88151.709 |  | 88010.012 |
| 933.0 | 88340.825 |  | 88198.976 |
| 934.0 | 88530.144 |  | 88388.142 |
| 935.0 | 88719.665 |  | 88577.512 |
| 936.0 | 88909.389 |  | 88767.084 |
| 937.0 | 89099.316 |  | 88956.858 |
| 938.0 | 89289.445 |  | 89146.836 |
| 939.0 | 89479.777 |  | 89337.015 |
| 940.0 | 89670.311 |  | 89527.398 |
| 941.0 | 89861.049 |  | 89717.983 |
| 942.0 | 90051.988 |  | 89908.771 |
| 943.0 | 90243.131 |  | 90099.761 |
| 944.0 | 90434.476 |  | 90290.954 |
| 945.0 | 90626.023 |  | 90482.35 |
| 946.0 | 90817.774 |  | 90673.948 |
| 947.0 | 91009.727 |  | 90865.749 |
| 948.0 | 91201.882 |  | 91057.753 |
| 949.0 | 91394.241 |  | 91249.959 |
| 950.0 | 91586.802 |  | 91442.368 |
| 951.0 | 91779.565 |  | 91634.98 |
| 952.0 | 91972.531 |  | 91827.794 |
| 953.0 | 92165.7 |  | 92020.811 |
| 954.0 | 92359.072 |  | 92214.03 |
| 955.0 | 92552.646 |  | 92407.453 |
| 956.0 | 92746.423 |  | 92601.077 |
| 957.0 | 92940.402 |  | 92794.905 |
| 958.0 | 93134.584 |  | 92988.935 |
| 959.0 | 93328.969 |  | 93183.167 |
| 960.0 | 93523.556 |  | 93377.603 |
| 961.0 | 93718.346 |  | 93572.241 |
| 962.0 | 93913.339 |  | 93767.081 |
| 963.0 | 94108.534 |  | 93962.125 |
| 964.0 | 94303.932 |  | 94157.371 |
| 965.0 | 94499.532 |  | 94352.819 |
| 966.0 | 94695.335 |  | 94548.47 |
| 967.0 | 94891.341 |  | 94744.324 |
| 968.0 | 95087.55 |  | 94940.381 |
| 969.0 | 95283.961 |  | 95136.64 |
| 970.0 | 95480.575 |  | 95333.102 |
| 971.0 | 95677.391 |  | 95529.766 |
| 972.0 | 95874.41 |  | 95726.633 |
| 973.0 | 96071.632 |  | 95923.703 |
| 974.0 | 96269.056 |  | 96120.975 |
| 975.0 | 96466.683 |  | 96318.45 |
| 976.0 | 96664.513 |  | 96516.128 |
| 977.0 | 96862.545 |  | 96714.008 |
| 978.0 | 97060.78 |  | 96912.091 |
| 979.0 | 97259.217 |  | 97110.377 |
| 980.0 | 97457.858 |  | 97308.865 |
| 981.0 | 97656.7 |  | 97507.556 |
| 982.0 | 97855.746 |  | 97706.449 |
| 983.0 | 98054.994 |  | 97905.545 |
| 984.0 | 98254.445 |  | 98104.844 |
| 985.0 | 98454.098 |  | 98304.345 |
| 986.0 | 98653.954 |  | 98504.049 |
| 987.0 | 98854.013 |  | 98703.956 |
| 988.0 | 99054.274 |  | 98904.065 |
| 989.0 | 99254.738 |  | 99104.377 |
| 990.0 | 99455.405 |  | 99304.892 |
| 991.0 | 99656.274 |  | 99505.609 |
| 992.0 | 99857.346 |  | 99706.529 |
| 993.0 | 100058.62 |  | 99907.652 |
| 994.0 | 100260.098 |  | 100108.977 |
| 995.0 | 100461.777 |  | 100310.505 |
| 996.0 | 100663.66 |  | 100512.235 |
| 997.0 | 100865.745 |  | 100714.168 |
| 998.0 | 101068.033 |  | 100916.304 |
| 999.0 | 101270.523 |  | 101118.643 |
| 1000.0 | 101473.216 |  | 101321.184 |